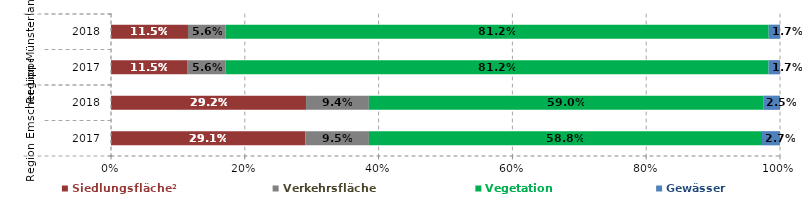
| Category | Siedlungsfläche² | Verkehrsfläche | Vegetation | Gewässer |
|---|---|---|---|---|
| 0 | 29.056 | 9.497 | 58.761 | 2.689 |
| 1 | 29.156 | 9.39 | 58.957 | 2.499 |
| 2 | 11.456 | 5.643 | 81.193 | 1.708 |
| 3 | 11.506 | 5.601 | 81.201 | 1.692 |